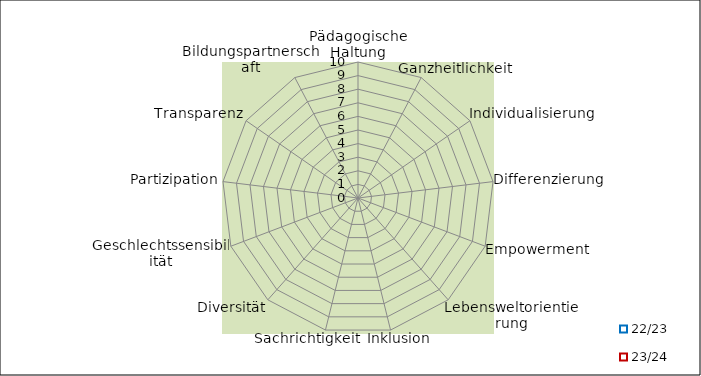
| Category | 22/23 | 23/24 |
|---|---|---|
| Pädagogische Haltung | 0 | 0 |
| Ganzheitlichkeit | 0 | 0 |
| Individualisierung | 0 | 0 |
| Differenzierung | 0 | 0 |
| Empowerment | 0 | 0 |
| Lebensweltorientierung | 0 | 0 |
| Inklusion | 0 | 0 |
| Sachrichtigkeit | 0 | 0 |
| Diversität | 0 | 0 |
| Geschlechtssensibilität | 0 | 0 |
| Partizipation | 0 | 0 |
| Transparenz | 0 | 0 |
| Bildungspartnerschaft | 0 | 0 |